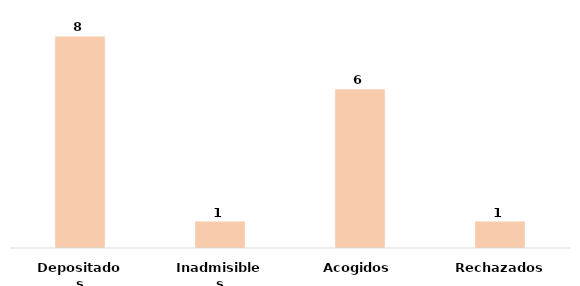
| Category | Series 0 |
|---|---|
| Depositados | 8 |
| Inadmisibles | 1 |
| Acogidos | 6 |
| Rechazados | 1 |